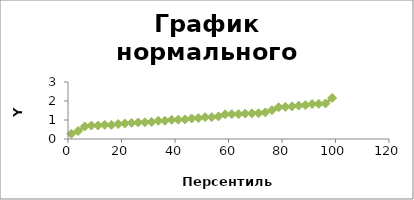
| Category | Series 0 |
|---|---|
| 1.25 | 0.28 |
| 3.75 | 0.42 |
| 6.25 | 0.66 |
| 8.75 | 0.71 |
| 11.25 | 0.71 |
| 13.75 | 0.74 |
| 16.25 | 0.74 |
| 18.75 | 0.79 |
| 21.25 | 0.82 |
| 23.75 | 0.85 |
| 26.25 | 0.87 |
| 28.75 | 0.88 |
| 31.25 | 0.9 |
| 33.75 | 0.96 |
| 36.25 | 0.96 |
| 38.75 | 1.01 |
| 41.25 | 1.02 |
| 43.75 | 1.03 |
| 46.25 | 1.08 |
| 48.75 | 1.1 |
| 51.25 | 1.15 |
| 53.75 | 1.15 |
| 56.25 | 1.19 |
| 58.75 | 1.3 |
| 61.25 | 1.31 |
| 63.75 | 1.31 |
| 66.25 | 1.34 |
| 68.75 | 1.35 |
| 71.25 | 1.36 |
| 73.75 | 1.4 |
| 76.25 | 1.52 |
| 78.75 | 1.67 |
| 81.25 | 1.69 |
| 83.75 | 1.72 |
| 86.25 | 1.76 |
| 88.75 | 1.78 |
| 91.25 | 1.84 |
| 93.75 | 1.85 |
| 96.25 | 1.87 |
| 98.75 | 2.16 |